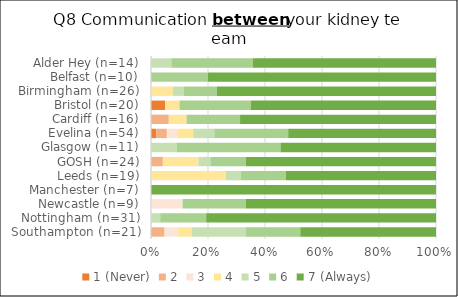
| Category | 1 (Never) | 2 | 3 | 4 | 5 | 6 | 7 (Always) |
|---|---|---|---|---|---|---|---|
| Southampton (n=21) | 0 | 1 | 1 | 1 | 4 | 4 | 10 |
| Nottingham (n=31) | 0 | 0 | 0 | 0 | 1 | 5 | 25 |
| Newcastle (n=9) | 0 | 0 | 1 | 0 | 0 | 2 | 6 |
| Manchester (n=7) | 0 | 0 | 0 | 0 | 0 | 0 | 7 |
| Leeds (n=19) | 0 | 0 | 0 | 5 | 1 | 3 | 10 |
| GOSH (n=24) | 0 | 1 | 0 | 3 | 1 | 3 | 16 |
| Glasgow (n=11) | 0 | 0 | 0 | 0 | 1 | 4 | 6 |
| Evelina (n=54) | 1 | 2 | 2 | 3 | 4 | 14 | 28 |
| Cardiff (n=16) | 0 | 1 | 0 | 1 | 0 | 3 | 11 |
| Bristol (n=20) | 1 | 0 | 0 | 1 | 0 | 5 | 13 |
| Birmingham (n=26) | 0 | 0 | 0 | 2 | 1 | 3 | 20 |
| Belfast (n=10) | 0 | 0 | 0 | 0 | 0 | 2 | 8 |
| Alder Hey (n=14) | 0 | 0 | 0 | 0 | 1 | 4 | 9 |